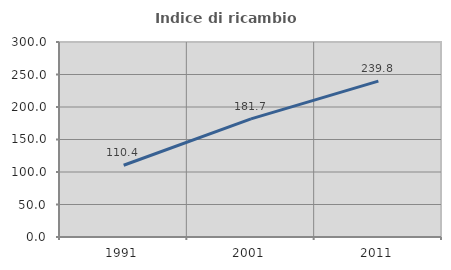
| Category | Indice di ricambio occupazionale  |
|---|---|
| 1991.0 | 110.385 |
| 2001.0 | 181.702 |
| 2011.0 | 239.773 |